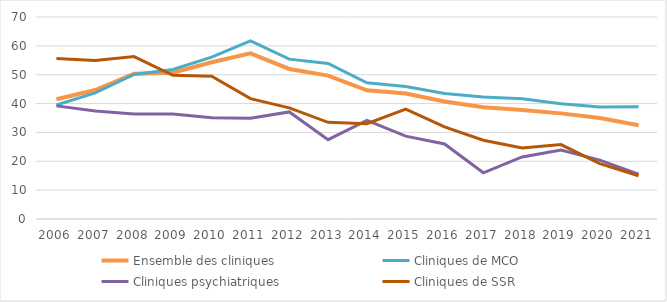
| Category | Ensemble des cliniques | Cliniques de MCO | Cliniques psychiatriques | Cliniques de SSR |
|---|---|---|---|---|
| 2006 | 41.5 | 39.5 | 39.2 | 55.6 |
| 2007 | 44.7 | 43.7 | 37.4 | 54.9 |
| 2008 | 50.3 | 50.1 | 36.4 | 56.3 |
| 2009 | 50.7 | 51.8 | 36.4 | 49.8 |
| 2010 | 54.3 | 56.1 | 35.1 | 49.5 |
| 2011 | 57.4 | 61.7 | 34.9 | 41.7 |
| 2012 | 52 | 55.4 | 37.1 | 38.5 |
| 2013 | 49.7 | 53.9 | 27.5 | 33.5 |
| 2014 | 44.6 | 47.2 | 34.2 | 33 |
| 2015 | 43.5 | 45.9 | 28.7 | 38.1 |
| 2016 | 40.7 | 43.5 | 26 | 31.9 |
| 2017 | 38.7 | 42.3 | 16 | 27.3 |
| 2018 | 37.8 | 41.7 | 21.5 | 24.6 |
| 2019 | 36.6 | 39.9 | 23.9 | 25.8 |
| 2020 | 35 | 38.8 | 20.4 | 19.2 |
| 2021 | 32.5 | 38.9 | 15.5 | 15 |